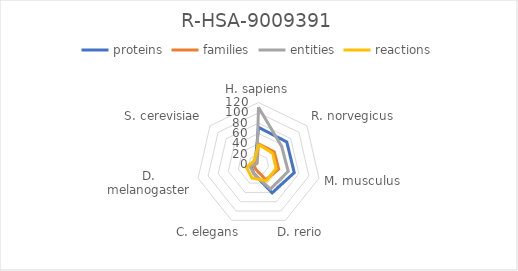
| Category | proteins | families | entities | reactions |
|---|---|---|---|---|
| H. sapiens | 72 | 40 | 111 | 39 |
| R. norvegicus | 70 | 39 | 57 | 35 |
| M. musculus | 71 | 40 | 59 | 35 |
| D. rerio | 61 | 33 | 53 | 35 |
| C. elegans | 20 | 11 | 20 | 29 |
| D. melanogaster | 15 | 9 | 17 | 24 |
| S. cerevisiae | 8 | 4 | 4 | 11 |